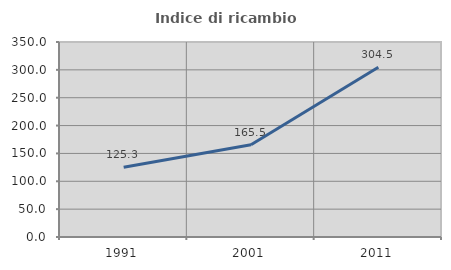
| Category | Indice di ricambio occupazionale  |
|---|---|
| 1991.0 | 125.267 |
| 2001.0 | 165.532 |
| 2011.0 | 304.545 |